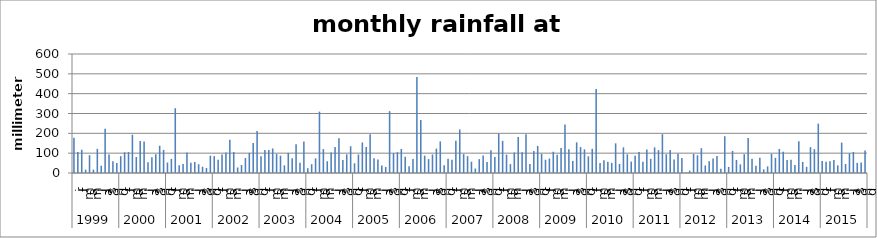
| Category | mm precip |
|---|---|
| 0 | 178.054 |
| 1 | 106.172 |
| 2 | 117.602 |
| 3 | 17.018 |
| 4 | 89.916 |
| 5 | 17.272 |
| 6 | 121.92 |
| 7 | 36.83 |
| 8 | 223.52 |
| 9 | 93.726 |
| 10 | 59.436 |
| 11 | 50.8 |
| 12 | 85.09 |
| 13 | 104.394 |
| 14 | 105.41 |
| 15 | 192.786 |
| 16 | 80.772 |
| 17 | 161.544 |
| 18 | 158.496 |
| 19 | 53.848 |
| 20 | 79.502 |
| 21 | 94.234 |
| 22 | 137.414 |
| 23 | 116.586 |
| 24 | 52.832 |
| 25 | 71.374 |
| 26 | 326.644 |
| 27 | 38.608 |
| 28 | 45.212 |
| 29 | 103.124 |
| 30 | 51.054 |
| 31 | 55.372 |
| 32 | 43.942 |
| 33 | 31.496 |
| 34 | 25.4 |
| 35 | 87.376 |
| 36 | 85.09 |
| 37 | 66.548 |
| 38 | 93.218 |
| 39 | 103.886 |
| 40 | 168.148 |
| 41 | 106.172 |
| 42 | 27.686 |
| 43 | 40.386 |
| 44 | 75.184 |
| 45 | 101.6 |
| 46 | 150.876 |
| 47 | 211.582 |
| 48 | 84.836 |
| 49 | 115.824 |
| 50 | 116.332 |
| 51 | 123.698 |
| 52 | 96.012 |
| 53 | 87.376 |
| 54 | 38.862 |
| 55 | 101.6 |
| 56 | 74.676 |
| 57 | 144.526 |
| 58 | 51.054 |
| 59 | 159.004 |
| 60 | 24.384 |
| 61 | 44.45 |
| 62 | 73.66 |
| 63 | 309.372 |
| 64 | 120.396 |
| 65 | 59.182 |
| 66 | 102.87 |
| 67 | 130.556 |
| 68 | 175.26 |
| 69 | 65.278 |
| 70 | 94.234 |
| 71 | 134.62 |
| 72 | 49.022 |
| 73 | 93.218 |
| 74 | 153.924 |
| 75 | 131.318 |
| 76 | 195.58 |
| 77 | 74.172 |
| 78 | 67.564 |
| 79 | 37.846 |
| 80 | 30.732 |
| 81 | 311.658 |
| 82 | 100.33 |
| 83 | 104.902 |
| 84 | 120.904 |
| 85 | 82.042 |
| 86 | 34.29 |
| 87 | 70.104 |
| 88 | 484.632 |
| 89 | 267.462 |
| 90 | 87.374 |
| 91 | 70.104 |
| 92 | 93.218 |
| 93 | 122.936 |
| 94 | 159.258 |
| 95 | 39.116 |
| 96 | 72.39 |
| 97 | 66.802 |
| 98 | 162.306 |
| 99 | 219.71 |
| 100 | 95.25 |
| 101 | 85.092 |
| 102 | 56.9 |
| 103 | 22.606 |
| 104 | 69.846 |
| 105 | 88.646 |
| 106 | 55.372 |
| 107 | 114.554 |
| 108 | 80.772 |
| 109 | 198.624 |
| 110 | 162.306 |
| 111 | 92.456 |
| 112 | 44.704 |
| 113 | 103.122 |
| 114 | 181.096 |
| 115 | 104.648 |
| 116 | 194.818 |
| 117 | 45.974 |
| 118 | 111.506 |
| 119 | 136.398 |
| 120 | 96.776 |
| 121 | 66.796 |
| 122 | 72.894 |
| 123 | 107.186 |
| 124 | 91.944 |
| 125 | 125.974 |
| 126 | 245.142 |
| 127 | 119.132 |
| 128 | 60.96 |
| 129 | 154.688 |
| 130 | 130.52 |
| 131 | 119.376 |
| 132 | 83.82 |
| 133 | 121.92 |
| 134 | 423.172 |
| 135 | 50.292 |
| 136 | 64.77 |
| 137 | 57.15 |
| 138 | 51.31 |
| 139 | 149.61 |
| 140 | 45.974 |
| 141 | 129.286 |
| 142 | 94.234 |
| 143 | 57.404 |
| 144 | 86.868 |
| 145 | 106.426 |
| 146 | 56.894 |
| 147 | 118.108 |
| 148 | 71.374 |
| 149 | 129.028 |
| 150 | 115.318 |
| 151 | 195.834 |
| 152 | 94.492 |
| 153 | 115.832 |
| 154 | 67.818 |
| 155 | 96.52 |
| 156 | 76.194 |
| 157 | 1.778 |
| 158 | 11.934 |
| 159 | 96.522 |
| 160 | 89.41 |
| 161 | 125.22 |
| 162 | 37.85 |
| 163 | 59.184 |
| 164 | 72.904 |
| 165 | 85.85 |
| 166 | 21.588 |
| 167 | 185.434 |
| 168 | 30.732 |
| 169 | 111.244 |
| 170 | 65.536 |
| 171 | 43.696 |
| 172 | 94.986 |
| 173 | 176.788 |
| 174 | 71.63 |
| 175 | 36.076 |
| 176 | 77.224 |
| 177 | 18.288 |
| 178 | 33.278 |
| 179 | 96.77 |
| 180 | 76.458 |
| 181 | 121.402 |
| 182 | 107.704 |
| 183 | 65.02 |
| 184 | 66.802 |
| 185 | 40.386 |
| 186 | 159.762 |
| 187 | 55.876 |
| 188 | 30.988 |
| 189 | 130.042 |
| 190 | 120.392 |
| 191 | 248.94 |
| 192 | 60.962 |
| 193 | 56.14 |
| 194 | 59.438 |
| 195 | 65.788 |
| 196 | 38.608 |
| 197 | 153.416 |
| 198 | 45.72 |
| 199 | 99.312 |
| 200 | 105.914 |
| 201 | 51.05 |
| 202 | 52.326 |
| 203 | 113.288 |